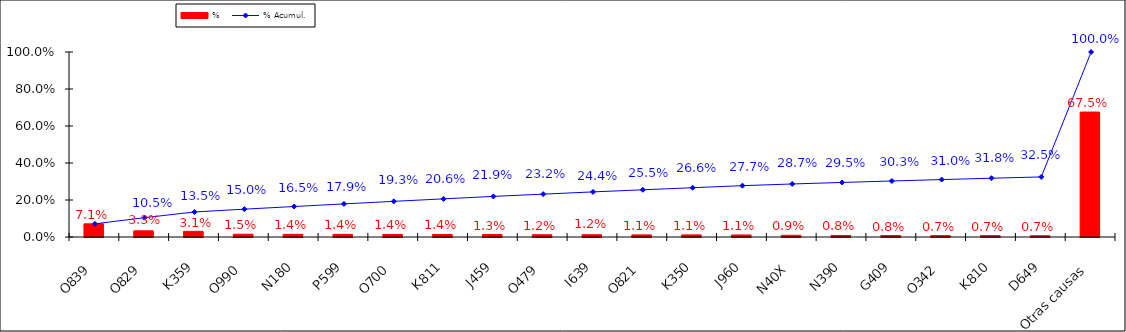
| Category | % |
|---|---|
| O839 | 0.071 |
| O829 | 0.033 |
| K359 | 0.031 |
| O990 | 0.015 |
| N180 | 0.014 |
| P599 | 0.014 |
| O700 | 0.014 |
| K811 | 0.014 |
| J459 | 0.013 |
| O479 | 0.012 |
| I639 | 0.012 |
| O821 | 0.011 |
| K350 | 0.011 |
| J960 | 0.011 |
| N40X | 0.009 |
| N390 | 0.008 |
| G409 | 0.008 |
| O342 | 0.007 |
| K810 | 0.007 |
| D649 | 0.007 |
| Otras causas | 0.675 |